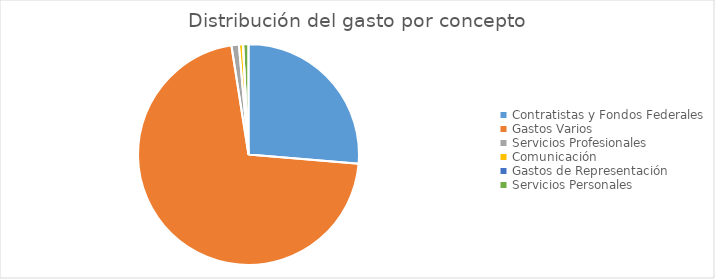
| Category | Series 0 |
|---|---|
| Contratistas y Fondos Federales | 151276668.41 |
| Gastos Varios | 409195551.31 |
| Servicios Profesionales | 6262114.83 |
| Comunicación | 3446744.84 |
| Gastos de Representación | 39078.75 |
| Servicios Personales | 4507034.92 |